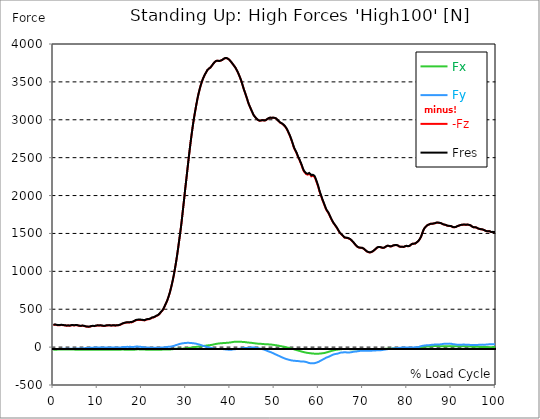
| Category |  Fx |  Fy |  -Fz |  Fres |
|---|---|---|---|---|
| 0.0 | -33.415 | -25.432 | 290.895 | 294.033 |
| 0.167348456675344 | -33.656 | -25.358 | 293.309 | 296.428 |
| 0.334696913350688 | -33.86 | -25.006 | 295.648 | 298.729 |
| 0.5020453700260321 | -33.768 | -24.244 | 294.497 | 297.523 |
| 0.669393826701376 | -33.656 | -23.873 | 292.882 | 295.871 |
| 0.83674228337672 | -33.378 | -23.39 | 291.564 | 294.497 |
| 1.0040907400520642 | -32.988 | -23.632 | 288.259 | 291.192 |
| 1.1621420602454444 | -32.988 | -24.486 | 287.127 | 290.153 |
| 1.3294905169207885 | -33.044 | -24.838 | 287.851 | 290.914 |
| 1.4968389735961325 | -33.081 | -24.95 | 288.909 | 291.972 |
| 1.6641874302714765 | -33.155 | -24.653 | 290.654 | 293.68 |
| 1.8315358869468206 | -33.044 | -23.817 | 291.471 | 294.404 |
| 1.9988843436221646 | -32.728 | -23.056 | 290.691 | 293.532 |
| 2.1662328002975086 | -32.431 | -22.834 | 289.689 | 292.492 |
| 2.333581256972853 | -32.264 | -22.963 | 287.628 | 290.45 |
| 2.5009297136481967 | -32.208 | -23.056 | 287.48 | 290.301 |
| 2.6682781703235405 | -31.911 | -22.017 | 286.032 | 288.742 |
| 2.8356266269988843 | -31.67 | -21.627 | 282.913 | 285.605 |
| 3.002975083674229 | -31.707 | -22.221 | 282.152 | 284.899 |
| 3.1703235403495724 | -32.023 | -22.425 | 283.711 | 286.496 |
| 3.337671997024917 | -32.227 | -21.775 | 284.732 | 287.461 |
| 3.4957233172182973 | -32.134 | -21.07 | 283.34 | 286.032 |
| 3.663071773893641 | -31.967 | -21.256 | 281.428 | 284.138 |
| 3.8304202305689854 | -32.431 | -22.091 | 283.359 | 286.162 |
| 3.997768687244329 | -32.858 | -22.611 | 286.644 | 289.485 |
| 4.165117143919673 | -33.081 | -21.942 | 289.095 | 291.898 |
| 4.332465600595017 | -33.081 | -20.996 | 289.745 | 292.473 |
| 4.499814057270361 | -33.007 | -20.81 | 287.925 | 290.636 |
| 4.667162513945706 | -33.044 | -21.07 | 285.679 | 288.464 |
| 4.834510970621049 | -33.359 | -21.218 | 286.83 | 289.67 |
| 5.001859427296393 | -33.545 | -21.163 | 288.705 | 291.545 |
| 5.169207883971737 | -33.638 | -20.272 | 290.171 | 292.956 |
| 5.336556340647081 | -33.266 | -18.638 | 288.594 | 291.248 |
| 5.503904797322425 | -33.081 | -18.527 | 285.66 | 288.315 |
| 5.671253253997769 | -33.229 | -17.784 | 283.396 | 286.05 |
| 5.82930457419115 | -33.229 | -17.84 | 279.739 | 282.43 |
| 5.996653030866494 | -33.229 | -17.97 | 279.33 | 282.041 |
| 6.164001487541838 | -33.359 | -17.766 | 279.627 | 282.375 |
| 6.331349944217181 | -33.638 | -17.469 | 280.388 | 283.154 |
| 6.498698400892526 | -33.972 | -16.782 | 281.112 | 283.897 |
| 6.66604685756787 | -34.547 | -16.132 | 281.168 | 283.99 |
| 6.833395314243213 | -35.03 | -15.13 | 280.203 | 283.043 |
| 7.000743770918558 | -35.067 | -13.979 | 277.604 | 280.407 |
| 7.168092227593902 | -35.049 | -13.088 | 275.116 | 277.901 |
| 7.335440684269246 | -34.807 | -12.865 | 271.868 | 274.634 |
| 7.50278914094459 | -34.584 | -12.401 | 269.64 | 272.387 |
| 7.6701375976199335 | -34.362 | -11.714 | 268.396 | 271.106 |
| 7.837486054295278 | -34.139 | -10.99 | 267.245 | 269.937 |
| 7.995537374488658 | -33.712 | -9.932 | 267.319 | 269.974 |
| 8.162885831164003 | -33.731 | -9.096 | 268.378 | 271.014 |
| 8.330234287839346 | -33.99 | -9.245 | 270.754 | 273.427 |
| 8.49758274451469 | -34.213 | -9.208 | 274.207 | 276.88 |
| 8.664931201190035 | -34.176 | -8.447 | 277.362 | 279.961 |
| 8.832279657865378 | -34.102 | -7.5 | 278.476 | 281.02 |
| 8.999628114540721 | -34.102 | -6.924 | 278.105 | 280.63 |
| 9.166976571216066 | -34.083 | -6.72 | 277.455 | 279.961 |
| 9.334325027891412 | -34.046 | -6.609 | 276.713 | 279.237 |
| 9.501673484566755 | -34.325 | -6.72 | 279.442 | 281.985 |
| 9.669021941242098 | -34.714 | -6.776 | 282.467 | 285.066 |
| 9.836370397917442 | -34.51 | -5.365 | 284.584 | 287.09 |
| 10.003718854592787 | -34.584 | -4.752 | 285.048 | 287.535 |
| 10.17106731126813 | -34.677 | -4.233 | 285.289 | 287.777 |
| 10.329118631461512 | -34.603 | -4.492 | 283.767 | 286.255 |
| 10.496467088136853 | -34.454 | -4.492 | 284.732 | 287.201 |
| 10.663815544812199 | -34.287 | -4.344 | 285.456 | 287.888 |
| 10.831164001487544 | -34.12 | -3.806 | 285.178 | 287.591 |
| 10.998512458162887 | -33.99 | -3.509 | 282.802 | 285.215 |
| 11.16586091483823 | -33.842 | -3.509 | 280.184 | 282.579 |
| 11.333209371513574 | -33.879 | -3.713 | 278.718 | 281.131 |
| 11.50055782818892 | -34.028 | -4.251 | 278.105 | 280.537 |
| 11.667906284864264 | -34.12 | -4.604 | 279.219 | 281.632 |
| 11.835254741539607 | -34.028 | -4.641 | 282.189 | 284.547 |
| 12.00260319821495 | -33.879 | -4.511 | 284.862 | 287.183 |
| 12.169951654890292 | -33.656 | -3.806 | 285.883 | 288.148 |
| 12.337300111565641 | -33.805 | -4.511 | 286.459 | 288.742 |
| 12.504648568240984 | -33.842 | -4.938 | 287.405 | 289.689 |
| 12.662699888434362 | -33.656 | -4.622 | 287.944 | 290.19 |
| 12.830048345109708 | -33.433 | -4.047 | 285.66 | 287.87 |
| 12.997396801785053 | -33.396 | -4.381 | 283.563 | 285.79 |
| 13.164745258460396 | -33.656 | -5.346 | 282.95 | 285.215 |
| 13.33209371513574 | -33.842 | -5.328 | 284.825 | 287.108 |
| 13.499442171811083 | -34.176 | -5.124 | 287.517 | 289.819 |
| 13.666790628486426 | -34.343 | -4.715 | 287.517 | 289.837 |
| 13.834139085161771 | -34.176 | -3.843 | 285.252 | 287.554 |
| 14.001487541837117 | -34.38 | -4.084 | 283.229 | 285.568 |
| 14.16883599851246 | -34.399 | -4.641 | 284.732 | 287.071 |
| 14.336184455187803 | -34.269 | -4.808 | 287.758 | 290.079 |
| 14.503532911863147 | -33.99 | -4.474 | 288.519 | 290.803 |
| 14.670881368538492 | -33.842 | -4.511 | 287.665 | 289.967 |
| 14.828932688731873 | -33.86 | -4.882 | 288.686 | 291.025 |
| 14.996281145407215 | -33.86 | -5.161 | 292.158 | 294.534 |
| 15.163629602082558 | -33.582 | -4.363 | 296.557 | 298.952 |
| 15.330978058757903 | -33.266 | -3.23 | 301.068 | 303.519 |
| 15.498326515433247 | -33.136 | -2.042 | 306.489 | 309.032 |
| 15.665674972108594 | -32.951 | -0.297 | 311 | 313.729 |
| 15.833023428783937 | -32.988 | 0.668 | 313.692 | 316.532 |
| 16.00037188545928 | -33.304 | 0.705 | 316.755 | 319.688 |
| 16.167720342134626 | -33.489 | 1.355 | 319.911 | 322.881 |
| 16.335068798809967 | -33.582 | 2.023 | 322.194 | 325.201 |
| 16.502417255485312 | -33.582 | 2.673 | 323.661 | 326.724 |
| 16.669765712160658 | -33.582 | 3.397 | 324.515 | 327.633 |
| 16.837114168836 | -33.693 | 3.267 | 323.735 | 326.891 |
| 17.004462625511344 | -33.879 | 2.692 | 324.069 | 327.262 |
| 17.16251394570472 | -33.638 | 2.989 | 326.872 | 330.102 |
| 17.32986240238007 | -33.489 | 3.713 | 326.501 | 329.787 |
| 17.497210859055414 | -33.693 | 3.174 | 325.313 | 328.673 |
| 17.664559315730756 | -34.157 | 2.283 | 326.334 | 329.768 |
| 17.8319077724061 | -34.454 | 1.838 | 329.824 | 333.37 |
| 17.999256229081443 | -34.64 | 1.819 | 334.539 | 338.14 |
| 18.166604685756788 | -34.77 | 1.931 | 338.902 | 342.651 |
| 18.333953142432133 | -34.38 | 3.267 | 343.561 | 347.589 |
| 18.501301599107478 | -33.433 | 5.068 | 348.759 | 353.01 |
| 18.668650055782823 | -32.115 | 6.423 | 354.013 | 358.375 |
| 18.835998512458165 | -30.983 | 6.869 | 356.129 | 360.491 |
| 19.00334696913351 | -29.758 | 7.054 | 358.264 | 362.608 |
| 19.170695425808855 | -29.312 | 6.887 | 359.693 | 363.926 |
| 19.338043882484197 | -29.832 | 5.662 | 358.913 | 363.035 |
| 19.496095202677576 | -30.129 | 5.086 | 359.953 | 364.037 |
| 19.66344365935292 | -30.408 | 4.307 | 359.396 | 363.387 |
| 19.830792116028263 | -30.927 | 2.246 | 357.057 | 360.788 |
| 19.998140572703612 | -31.447 | 1.299 | 357.744 | 361.457 |
| 20.165489029378953 | -32.004 | 0.204 | 356.426 | 360.046 |
| 20.3328374860543 | -32.561 | -1.708 | 354.031 | 357.447 |
| 20.500185942729644 | -32.802 | -3.341 | 351.618 | 354.904 |
| 20.667534399404985 | -32.914 | -4.66 | 352.583 | 355.85 |
| 20.83488285608033 | -33.471 | -5.922 | 356.834 | 360.213 |
| 21.002231312755672 | -33.768 | -5.903 | 362.106 | 365.485 |
| 21.16957976943102 | -33.823 | -5.532 | 365.374 | 368.697 |
| 21.336928226106362 | -34.028 | -5.866 | 367.453 | 370.813 |
| 21.504276682781704 | -34.065 | -6.256 | 368.622 | 372.001 |
| 21.67162513945705 | -33.916 | -6.72 | 368.827 | 372.242 |
| 21.82967645965043 | -34.139 | -8.001 | 371.537 | 375.027 |
| 21.997024916325774 | -34.454 | -8.836 | 376.865 | 380.392 |
| 22.16437337300112 | -34.566 | -8.799 | 383.678 | 387.149 |
| 22.33172182967646 | -34.584 | -8.279 | 388.207 | 391.623 |
| 22.499070286351806 | -34.38 | -8.224 | 389.135 | 392.533 |
| 22.666418743027148 | -34.343 | -8.874 | 391.289 | 394.705 |
| 22.833767199702496 | -34.659 | -9.115 | 395.744 | 399.141 |
| 23.00111565637784 | -34.956 | -9.598 | 400.589 | 404.005 |
| 23.168464113053183 | -35.141 | -9.746 | 407.179 | 410.595 |
| 23.335812569728528 | -35.29 | -9.152 | 412.86 | 416.22 |
| 23.50316102640387 | -35.216 | -8.725 | 416.703 | 420.007 |
| 23.670509483079215 | -35.03 | -8.335 | 420.267 | 423.516 |
| 23.83785793975456 | -35.178 | -8.576 | 426.653 | 429.902 |
| 23.995909259947936 | -35.104 | -8.428 | 438.125 | 441.281 |
| 24.163257716623285 | -34.881 | -7.426 | 450.637 | 453.663 |
| 24.330606173298627 | -34.213 | -5.848 | 462.778 | 465.637 |
| 24.49795462997397 | -33.638 | -5.031 | 473.638 | 476.348 |
| 24.665303086649313 | -33.099 | -4.307 | 484.368 | 486.93 |
| 24.83265154332466 | -32.914 | -3.954 | 499.405 | 501.892 |
| 25.0 | -32.505 | -3.787 | 517.727 | 520.122 |
| 25.167348456675345 | -32.06 | -2.896 | 539.001 | 541.285 |
| 25.334696913350694 | -31.429 | -1.875 | 560.74 | 562.819 |
| 25.502045370026035 | -30.593 | -0.13 | 581.661 | 583.555 |
| 25.669393826701377 | -29.962 | 1.578 | 602.527 | 604.272 |
| 25.836742283376722 | -30.111 | 2.673 | 628.739 | 630.391 |
| 26.004090740052067 | -30.333 | 3.843 | 657.42 | 658.998 |
| 26.17143919672741 | -30.705 | 4.363 | 687.92 | 689.424 |
| 26.329490516920792 | -30.909 | 4.455 | 719.943 | 721.354 |
| 26.49683897359613 | -30.389 | 5.773 | 757.071 | 758.426 |
| 26.66418743027148 | -29.572 | 8.075 | 796.389 | 797.688 |
| 26.831535886946828 | -28.533 | 9.876 | 838.065 | 839.364 |
| 26.998884343622166 | -27.177 | 12.642 | 882.692 | 883.973 |
| 27.166232800297514 | -25.729 | 15.427 | 930.216 | 931.515 |
| 27.333581256972852 | -24.597 | 17.821 | 981.322 | 982.622 |
| 27.5009297136482 | -23.409 | 21.274 | 1037.162 | 1038.517 |
| 27.668278170323543 | -22.444 | 25.006 | 1094.562 | 1096.028 |
| 27.835626626998888 | -21.608 | 28.198 | 1154.337 | 1155.841 |
| 28.002975083674233 | -20.996 | 31.243 | 1218.958 | 1220.499 |
| 28.170323540349575 | -20.773 | 34.714 | 1286.753 | 1288.368 |
| 28.33767199702492 | -20.587 | 37.815 | 1358.187 | 1359.839 |
| 28.50502045370026 | -20.55 | 40.673 | 1429.936 | 1431.625 |
| 28.663071773893645 | -20.903 | 43.328 | 1500.59 | 1502.298 |
| 28.830420230568986 | -21.59 | 45.259 | 1575.18 | 1576.85 |
| 28.99776868724433 | -21.794 | 47.189 | 1655.153 | 1656.805 |
| 29.165117143919673 | -20.513 | 49.491 | 1742.124 | 1743.758 |
| 29.33246560059502 | -19.808 | 50.865 | 1830.507 | 1832.066 |
| 29.499814057270367 | -19.232 | 52.257 | 1917.256 | 1918.778 |
| 29.66716251394571 | -18.155 | 53.371 | 2006.399 | 2007.884 |
| 29.834510970621054 | -17.042 | 54.633 | 2098.606 | 2100.054 |
| 30.00185942729639 | -16.448 | 55.395 | 2182.719 | 2184.129 |
| 30.169207883971744 | -15 | 56.063 | 2268.502 | 2269.876 |
| 30.33655634064708 | -13.217 | 56.545 | 2355.474 | 2356.792 |
| 30.50390479732243 | -11.732 | 56.527 | 2442.185 | 2443.448 |
| 30.671253253997772 | -10.507 | 56.323 | 2527.115 | 2528.322 |
| 30.829304574191156 | -9.468 | 55.432 | 2608.592 | 2609.724 |
| 30.996653030866494 | -8.502 | 54.206 | 2688.917 | 2690.013 |
| 31.164001487541842 | -7.407 | 53.594 | 2764.769 | 2765.846 |
| 31.331349944217187 | -6.033 | 53.018 | 2836.964 | 2838.004 |
| 31.498698400892525 | -4.455 | 51.83 | 2907.061 | 2908.101 |
| 31.666046857567874 | -2.766 | 50.382 | 2973.464 | 2974.485 |
| 31.833395314243212 | -1.151 | 49.25 | 3034.595 | 3035.597 |
| 32.00074377091856 | 0.353 | 48.452 | 3091.939 | 3092.941 |
| 32.1680922275939 | 1.764 | 47.264 | 3146.813 | 3147.797 |
| 32.33544068426925 | 3.082 | 44.201 | 3201.317 | 3202.264 |
| 32.50278914094459 | 4.381 | 41.286 | 3253.166 | 3254.094 |
| 32.670137597619934 | 5.681 | 38.891 | 3301.153 | 3302.044 |
| 32.83748605429528 | 7.017 | 36.497 | 3345.242 | 3346.115 |
| 33.004834510970625 | 8.447 | 34.269 | 3385.08 | 3385.916 |
| 33.162885831164004 | 9.653 | 31.484 | 3421.911 | 3422.746 |
| 33.33023428783935 | 10.544 | 28.013 | 3456.236 | 3457.034 |
| 33.497582744514695 | 11.565 | 24.579 | 3488.054 | 3488.796 |
| 33.664931201190036 | 13.125 | 21.386 | 3516.531 | 3517.255 |
| 33.83227965786538 | 14.461 | 18.155 | 3542.242 | 3542.929 |
| 33.99962811454073 | 15.408 | 14.888 | 3565.02 | 3565.669 |
| 34.16697657121607 | 16.578 | 12.159 | 3585.273 | 3585.885 |
| 34.33432502789141 | 17.469 | 8.985 | 3604.746 | 3605.34 |
| 34.50167348456676 | 18.972 | 6.293 | 3621.899 | 3622.493 |
| 34.6690219412421 | 20.643 | 3.453 | 3639.182 | 3639.776 |
| 34.83637039791744 | 22.295 | 0.613 | 3656.465 | 3657.041 |
| 35.00371885459279 | 23.558 | -2.209 | 3668.495 | 3669.07 |
| 35.17106731126814 | 24.876 | -4.121 | 3675.512 | 3676.087 |
| 35.338415767943474 | 25.414 | -5.328 | 3678.556 | 3679.113 |
| 35.49646708813686 | 26.472 | -7.908 | 3688.562 | 3689.082 |
| 35.6638155448122 | 28.031 | -10.266 | 3700.239 | 3700.74 |
| 35.831164001487544 | 30.055 | -12.271 | 3713.289 | 3713.79 |
| 35.998512458162885 | 31.596 | -14.833 | 3726.729 | 3727.231 |
| 36.165860914838234 | 33.601 | -17.691 | 3740.597 | 3741.098 |
| 36.333209371513576 | 36.348 | -19.511 | 3752.756 | 3753.257 |
| 36.50055782818892 | 38.65 | -21.664 | 3763.059 | 3763.597 |
| 36.667906284864266 | 40.395 | -23.539 | 3770.67 | 3771.245 |
| 36.83525474153961 | 42.511 | -25.08 | 3776.703 | 3777.297 |
| 37.002603198214956 | 44.423 | -26.138 | 3779.655 | 3780.286 |
| 37.1699516548903 | 46.15 | -25.748 | 3778.819 | 3779.469 |
| 37.337300111565646 | 47.375 | -25.358 | 3776.425 | 3777.093 |
| 37.50464856824098 | 47.876 | -25.395 | 3774.791 | 3775.459 |
| 37.66269988843437 | 49.51 | -25.061 | 3777.761 | 3778.467 |
| 37.83004834510971 | 50.401 | -25.247 | 3781.121 | 3781.845 |
| 37.99739680178505 | 51.478 | -25.432 | 3784.426 | 3785.168 |
| 38.16474525846039 | 52.666 | -25.321 | 3788.733 | 3789.475 |
| 38.33209371513574 | 52.833 | -25.878 | 3795.824 | 3796.567 |
| 38.49944217181109 | 52.814 | -27.345 | 3803.342 | 3804.085 |
| 38.666790628486424 | 52.796 | -29.201 | 3810.081 | 3810.824 |
| 38.83413908516178 | 53.482 | -30.315 | 3813.033 | 3813.775 |
| 39.001487541837115 | 55.58 | -30.352 | 3814.054 | 3814.833 |
| 39.16883599851246 | 56.323 | -31.484 | 3813.571 | 3814.351 |
| 39.336184455187805 | 56.991 | -32.895 | 3810.304 | 3811.102 |
| 39.503532911863154 | 58.216 | -33.341 | 3804.53 | 3805.329 |
| 39.670881368538495 | 58.866 | -33.916 | 3797.049 | 3797.847 |
| 39.83822982521384 | 59.571 | -34.51 | 3788.343 | 3789.16 |
| 39.996281145407224 | 61.354 | -34.195 | 3776.815 | 3777.65 |
| 40.163629602082565 | 62.931 | -33.916 | 3765.175 | 3766.029 |
| 40.33097805875791 | 64.231 | -33.452 | 3753.127 | 3754 |
| 40.498326515433256 | 66.663 | -31.503 | 3740.058 | 3740.986 |
| 40.6656749721086 | 68.315 | -29.814 | 3727.156 | 3728.103 |
| 40.83302342878393 | 69.466 | -28.607 | 3714.421 | 3715.387 |
| 41.00037188545929 | 70.357 | -27.66 | 3701.78 | 3702.763 |
| 41.16772034213463 | 70.765 | -26.268 | 3686.928 | 3687.949 |
| 41.33506879880997 | 70.97 | -26.082 | 3669.293 | 3670.332 |
| 41.50241725548531 | 70.673 | -26.324 | 3650.71 | 3651.75 |
| 41.66976571216066 | 70.858 | -24.597 | 3631.775 | 3632.833 |
| 41.837114168836 | 70.765 | -23.502 | 3610.315 | 3611.392 |
| 42.004462625511344 | 70.728 | -22.147 | 3586.647 | 3587.723 |
| 42.17181108218669 | 70.171 | -21.738 | 3562.996 | 3564.11 |
| 42.32986240238007 | 69.614 | -20.921 | 3537.879 | 3539.012 |
| 42.497210859055414 | 69.243 | -19.548 | 3510.275 | 3511.426 |
| 42.66455931573076 | 69.002 | -17.134 | 3479.979 | 3481.13 |
| 42.831907772406105 | 68.649 | -14.517 | 3446.675 | 3447.826 |
| 42.999256229081446 | 68.166 | -12.493 | 3413.891 | 3415.042 |
| 43.16660468575679 | 67.238 | -12.271 | 3385.433 | 3386.64 |
| 43.33395314243214 | 65.92 | -12.865 | 3357.439 | 3358.664 |
| 43.50130159910748 | 64.361 | -13.96 | 3328.386 | 3329.649 |
| 43.66865005578282 | 63.136 | -13.292 | 3299.315 | 3300.596 |
| 43.83599851245817 | 61.725 | -12.586 | 3270.133 | 3271.395 |
| 44.00334696913351 | 60.871 | -11.565 | 3237.201 | 3238.444 |
| 44.17069542580886 | 59.943 | -10.154 | 3209.262 | 3210.524 |
| 44.3380438824842 | 59.033 | -8.521 | 3185.445 | 3186.688 |
| 44.49609520267758 | 58.142 | -7.778 | 3163.15 | 3164.43 |
| 44.66344365935292 | 57.307 | -6.534 | 3140.65 | 3141.912 |
| 44.83079211602827 | 56.23 | -4.919 | 3118.633 | 3119.914 |
| 44.99814057270361 | 54.782 | -4.177 | 3096.895 | 3098.139 |
| 45.16548902937895 | 53.111 | -4.233 | 3074.099 | 3075.324 |
| 45.332837486054295 | 51.775 | -5.495 | 3056.63 | 3057.874 |
| 45.500185942729644 | 50.735 | -6.386 | 3045.139 | 3046.364 |
| 45.66753439940499 | 49.454 | -8.131 | 3032.349 | 3033.555 |
| 45.83488285608033 | 48.173 | -9.913 | 3019.911 | 3021.099 |
| 46.00223131275568 | 46.967 | -12.048 | 3010.499 | 3011.687 |
| 46.16957976943102 | 45.667 | -14.016 | 3000.066 | 3001.254 |
| 46.336928226106366 | 44.925 | -15.742 | 2994.738 | 2995.945 |
| 46.50427668278171 | 44.256 | -17.153 | 2990.487 | 2991.694 |
| 46.671625139457056 | 43.569 | -18.749 | 2987.201 | 2988.408 |
| 46.829676459650436 | 43.328 | -20.457 | 2988.464 | 2989.67 |
| 46.99702491632577 | 42.994 | -22.462 | 2990.951 | 2992.139 |
| 47.16437337300112 | 42.493 | -24.894 | 2994.089 | 2995.277 |
| 47.33172182967646 | 41.639 | -27.623 | 2994.683 | 2995.852 |
| 47.49907028635181 | 40.748 | -30.389 | 2993.736 | 2994.924 |
| 47.66641874302716 | 39.43 | -33.304 | 2990.264 | 2991.471 |
| 47.83376719970249 | 38 | -36.534 | 2987.981 | 2989.188 |
| 48.001115656377834 | 37.369 | -40.432 | 2993.105 | 2994.33 |
| 48.16846411305319 | 37.221 | -44.609 | 3000.66 | 3001.922 |
| 48.33581256972853 | 36.979 | -48.767 | 3007.844 | 3009.125 |
| 48.50316102640387 | 36.608 | -52.926 | 3014.379 | 3015.715 |
| 48.67050948307921 | 36.107 | -56.713 | 3019.688 | 3021.062 |
| 48.837857939754564 | 35.476 | -60.128 | 3023.772 | 3025.164 |
| 49.005206396429905 | 34.881 | -63.637 | 3027.522 | 3028.914 |
| 49.163257716623285 | 34.269 | -67.48 | 3027.893 | 3029.341 |
| 49.33060617329863 | 33.044 | -71.118 | 3024.106 | 3025.591 |
| 49.49795462997397 | 31.874 | -75.332 | 3025.35 | 3026.891 |
| 49.66530308664932 | 30.575 | -79.528 | 3027.002 | 3028.58 |
| 49.832651543324666 | 28.978 | -84.466 | 3025.777 | 3027.411 |
| 50.0 | 27.345 | -89.552 | 3024.069 | 3025.796 |
| 50.16734845667534 | 26.027 | -94.249 | 3021.619 | 3023.438 |
| 50.33469691335069 | 24.987 | -98.537 | 3016.885 | 3018.816 |
| 50.50204537002604 | 23.595 | -102.175 | 3006.749 | 3008.791 |
| 50.66939382670139 | 21.961 | -106.501 | 2997.337 | 2999.491 |
| 50.836742283376715 | 20.16 | -110.993 | 2987.74 | 2990.023 |
| 51.00409074005207 | 17.951 | -115.968 | 2977.66 | 2980.11 |
| 51.17143919672741 | 15.631 | -120.646 | 2968.248 | 2970.865 |
| 51.32949051692079 | 13.292 | -125.102 | 2959.745 | 2962.53 |
| 51.496838973596134 | 11.324 | -129.613 | 2956.348 | 2959.318 |
| 51.66418743027148 | 9.653 | -133.827 | 2949.869 | 2953.044 |
| 51.831535886946824 | 7.76 | -137.911 | 2942.295 | 2945.693 |
| 51.99888434362217 | 6.312 | -142.181 | 2934.888 | 2938.471 |
| 52.16623280029752 | 4.641 | -146.32 | 2925.551 | 2929.356 |
| 52.33358125697285 | 2.543 | -150.33 | 2915.081 | 2919.109 |
| 52.5009297136482 | 0.149 | -153.801 | 2901.752 | 2906.003 |
| 52.668278170323546 | -2.228 | -156.92 | 2887.179 | 2891.635 |
| 52.835626626998895 | -4.455 | -159.649 | 2870.528 | 2875.15 |
| 53.00297508367424 | -6.887 | -162.489 | 2849.977 | 2854.804 |
| 53.17032354034958 | -9.208 | -165.292 | 2828.518 | 2833.567 |
| 53.33767199702492 | -11.398 | -168.133 | 2807.058 | 2812.33 |
| 53.50502045370027 | -13.7 | -170.843 | 2784.094 | 2789.571 |
| 53.663071773893655 | -16.132 | -173.294 | 2758.718 | 2764.38 |
| 53.83042023056899 | -18.879 | -175.54 | 2731.206 | 2737.091 |
| 53.99776868724433 | -21.813 | -177.322 | 2702.618 | 2708.725 |
| 54.16511714391967 | -24.838 | -178.51 | 2672.656 | 2678.93 |
| 54.33246560059503 | -28.087 | -179.085 | 2642.099 | 2648.504 |
| 54.49981405727037 | -31.076 | -180.069 | 2617.261 | 2623.814 |
| 54.667162513945705 | -34.028 | -181.499 | 2597.361 | 2604.099 |
| 54.834510970621054 | -36.664 | -181.87 | 2578.258 | 2585.09 |
| 55.0018594272964 | -39.597 | -182.093 | 2557.987 | 2564.967 |
| 55.169207883971744 | -42.4 | -182.891 | 2532.369 | 2539.534 |
| 55.336556340647086 | -45.036 | -184.042 | 2506.936 | 2514.306 |
| 55.50390479732243 | -47.765 | -185.973 | 2487.221 | 2494.814 |
| 55.671253253997776 | -50.494 | -187.532 | 2466.393 | 2474.189 |
| 55.83860171067312 | -53.278 | -187.569 | 2441.146 | 2449.073 |
| 55.9966530308665 | -56.026 | -188.943 | 2419.296 | 2427.464 |
| 56.16400148754184 | -59.033 | -190.335 | 2393.251 | 2401.661 |
| 56.33134994421718 | -61.688 | -190.614 | 2365.034 | 2373.629 |
| 56.498698400892536 | -63.878 | -190.651 | 2338.803 | 2347.528 |
| 56.66604685756788 | -66.124 | -190.799 | 2319.126 | 2327.999 |
| 56.83339531424321 | -68.519 | -191.802 | 2305.091 | 2314.188 |
| 57.00074377091856 | -71.137 | -194.363 | 2294.12 | 2303.569 |
| 57.16809222759391 | -73.476 | -196.814 | 2283.854 | 2293.675 |
| 57.33544068426925 | -75.128 | -199.413 | 2276.54 | 2286.75 |
| 57.5027891409446 | -76.483 | -202.996 | 2276.299 | 2286.973 |
| 57.670137597619934 | -77.69 | -207.043 | 2281.794 | 2292.951 |
| 57.83748605429528 | -78.952 | -210.607 | 2286.49 | 2298.074 |
| 58.004834510970625 | -80.456 | -211.591 | 2277.041 | 2288.867 |
| 58.16288583116401 | -81.718 | -212.983 | 2269.634 | 2281.757 |
| 58.330234287839346 | -82.609 | -211.813 | 2254.245 | 2266.423 |
| 58.497582744514695 | -83.871 | -212.89 | 2263.211 | 2275.519 |
| 58.66493120119004 | -85.412 | -213.837 | 2262.023 | 2274.461 |
| 58.832279657865385 | -86.396 | -214.264 | 2260.761 | 2273.292 |
| 58.999628114540734 | -86.173 | -212.76 | 2249.715 | 2262.153 |
| 59.16697657121607 | -85.858 | -210.477 | 2233.194 | 2245.483 |
| 59.33432502789142 | -86.192 | -207.692 | 2208.299 | 2220.422 |
| 59.50167348456676 | -86.396 | -204.611 | 2181.233 | 2193.207 |
| 59.66902194124211 | -86.842 | -201.195 | 2153.221 | 2165.027 |
| 59.83637039791745 | -87.566 | -198.262 | 2124.614 | 2136.29 |
| 60.00371885459278 | -86.805 | -193.305 | 2091.867 | 2103.172 |
| 60.17106731126813 | -85.022 | -186.864 | 2055.723 | 2066.435 |
| 60.33841576794349 | -84.595 | -181.684 | 2025.835 | 2036.138 |
| 60.49646708813685 | -83.909 | -176.876 | 1999.679 | 2009.629 |
| 60.6638155448122 | -82.665 | -171.66 | 1970.831 | 1980.373 |
| 60.831164001487544 | -81.124 | -166.369 | 1942.354 | 1951.487 |
| 60.99851245816289 | -80.159 | -161.654 | 1917.07 | 1925.869 |
| 61.16586091483824 | -78.933 | -156.697 | 1892.696 | 1901.105 |
| 61.333209371513576 | -76.78 | -150.998 | 1867.263 | 1875.208 |
| 61.50055782818892 | -74.33 | -145.206 | 1842.035 | 1849.516 |
| 61.667906284864266 | -71.842 | -139.712 | 1817.642 | 1824.696 |
| 61.835254741539615 | -69.095 | -135.59 | 1799.264 | 1805.965 |
| 62.002603198214956 | -66.18 | -132.546 | 1785.601 | 1792.024 |
| 62.16995165489029 | -63.247 | -129.334 | 1771.139 | 1777.284 |
| 62.33730011156564 | -60.24 | -125.213 | 1752.074 | 1757.885 |
| 62.504648568240995 | -57.344 | -121.24 | 1731.617 | 1737.131 |
| 62.67199702491633 | -54.466 | -115.931 | 1710.064 | 1715.207 |
| 62.83004834510971 | -51.663 | -110.696 | 1690.331 | 1695.083 |
| 62.99739680178505 | -48.582 | -105.74 | 1671.6 | 1676.018 |
| 63.1647452584604 | -45.741 | -100.69 | 1653.055 | 1657.12 |
| 63.33209371513575 | -43.254 | -97.182 | 1637.238 | 1641.081 |
| 63.4994421718111 | -41.137 | -94.713 | 1623.835 | 1627.53 |
| 63.666790628486424 | -39.058 | -92.281 | 1610.395 | 1613.941 |
| 63.83413908516177 | -37.313 | -90.629 | 1596.379 | 1599.832 |
| 64.00148754183712 | -35.568 | -88.977 | 1582.364 | 1585.742 |
| 64.16883599851248 | -34.065 | -87.714 | 1567.958 | 1571.281 |
| 64.3361844551878 | -32.58 | -85.301 | 1550.768 | 1553.942 |
| 64.50353291186315 | -31.447 | -81.699 | 1533.467 | 1536.474 |
| 64.6708813685385 | -30.463 | -78.247 | 1517.594 | 1520.472 |
| 64.83822982521384 | -29.108 | -74.46 | 1504.247 | 1506.939 |
| 65.00557828188919 | -28.031 | -72.046 | 1493.35 | 1495.912 |
| 65.16362960208257 | -26.472 | -72.548 | 1487.02 | 1489.619 |
| 65.3309780587579 | -26.064 | -71.898 | 1477.385 | 1479.984 |
| 65.49832651543326 | -26.453 | -71.007 | 1465.876 | 1468.512 |
| 65.6656749721086 | -26.212 | -68.705 | 1454.589 | 1457.188 |
| 65.83302342878395 | -26.082 | -66.459 | 1445.233 | 1447.72 |
| 66.00037188545929 | -24.801 | -66.254 | 1441.483 | 1443.989 |
| 66.16772034213463 | -24.579 | -68.928 | 1442.299 | 1444.991 |
| 66.33506879880998 | -25.34 | -70.914 | 1441.724 | 1444.601 |
| 66.50241725548531 | -26.212 | -71.879 | 1438.698 | 1441.743 |
| 66.66976571216065 | -25.822 | -70.524 | 1432.813 | 1435.821 |
| 66.83711416883601 | -26.361 | -71.007 | 1431.829 | 1434.911 |
| 67.00446262551135 | -26.695 | -70.58 | 1428.005 | 1431.087 |
| 67.1718110821867 | -27.252 | -69.373 | 1421.359 | 1424.423 |
| 67.32986240238007 | -27.994 | -67.498 | 1412.56 | 1415.549 |
| 67.49721085905541 | -28.496 | -65.308 | 1403.371 | 1406.267 |
| 67.66455931573076 | -28.7 | -63.284 | 1393.625 | 1396.447 |
| 67.83190777240611 | -28.588 | -61.354 | 1382.338 | 1385.104 |
| 67.99925622908145 | -28.514 | -60.017 | 1370.068 | 1372.778 |
| 68.16660468575678 | -28.811 | -59.052 | 1358.15 | 1360.841 |
| 68.33395314243214 | -29.349 | -58.253 | 1346.491 | 1349.165 |
| 68.50130159910749 | -29.702 | -57.214 | 1336.114 | 1338.75 |
| 68.66865005578282 | -29.999 | -56.007 | 1326.925 | 1329.487 |
| 68.83599851245816 | -30.092 | -54.671 | 1319.592 | 1322.08 |
| 69.00334696913352 | -30.111 | -53.018 | 1314.599 | 1317.012 |
| 69.17069542580886 | -29.981 | -51.143 | 1312.074 | 1314.376 |
| 69.3380438824842 | -29.906 | -49.324 | 1310.608 | 1312.817 |
| 69.50539233915956 | -29.312 | -48.377 | 1310.069 | 1312.185 |
| 69.66344365935292 | -28.96 | -48.415 | 1309.438 | 1311.554 |
| 69.83079211602826 | -28.607 | -48.452 | 1308.825 | 1310.923 |
| 69.99814057270362 | -28.7 | -48.34 | 1304.407 | 1306.468 |
| 70.16548902937896 | -29.219 | -47.635 | 1298.244 | 1300.249 |
| 70.33283748605429 | -29.851 | -47.579 | 1289.983 | 1291.969 |
| 70.50018594272964 | -30.649 | -47.653 | 1281.444 | 1283.412 |
| 70.667534399405 | -31.596 | -47.394 | 1272.236 | 1274.222 |
| 70.83488285608033 | -32.617 | -47.895 | 1264.031 | 1266.036 |
| 71.00223131275568 | -33.266 | -47.542 | 1259.111 | 1261.098 |
| 71.16957976943102 | -33.879 | -47.876 | 1254.415 | 1256.42 |
| 71.33692822610637 | -34.343 | -48.377 | 1250.219 | 1252.261 |
| 71.50427668278171 | -34.436 | -48.08 | 1248.809 | 1250.869 |
| 71.67162513945706 | -34.584 | -48.043 | 1249.217 | 1251.278 |
| 71.8389735961324 | -34.603 | -47.561 | 1251.834 | 1253.876 |
| 71.99702491632577 | -34.733 | -46.67 | 1255.194 | 1257.181 |
| 72.16437337300113 | -34.454 | -45.89 | 1261.024 | 1262.973 |
| 72.33172182967647 | -34.028 | -45.37 | 1267.409 | 1269.322 |
| 72.49907028635181 | -33.619 | -44.795 | 1275.54 | 1277.378 |
| 72.66641874302715 | -33.118 | -44.498 | 1283.764 | 1285.583 |
| 72.8337671997025 | -32.134 | -44.015 | 1293.065 | 1294.791 |
| 73.00111565637783 | -30.853 | -43.161 | 1303.163 | 1304.816 |
| 73.16846411305319 | -29.721 | -42.4 | 1310.552 | 1312.111 |
| 73.33581256972853 | -28.737 | -42.196 | 1317.123 | 1318.627 |
| 73.50316102640387 | -28.236 | -43.012 | 1321.04 | 1322.526 |
| 73.67050948307921 | -27.939 | -42.753 | 1321.69 | 1323.157 |
| 73.83785793975457 | -27.864 | -42.53 | 1320.409 | 1321.839 |
| 74.00520639642991 | -27.827 | -41.843 | 1317.643 | 1319.073 |
| 74.16325771662328 | -27.772 | -40.191 | 1314.116 | 1315.508 |
| 74.33060617329863 | -27.623 | -38.371 | 1310.738 | 1312.093 |
| 74.49795462997398 | -26.992 | -36.329 | 1308.677 | 1309.976 |
| 74.66530308664932 | -26.268 | -34.807 | 1309.382 | 1310.608 |
| 74.83265154332466 | -24.69 | -33.433 | 1312.483 | 1313.689 |
| 75.00000000000001 | -23.131 | -32.19 | 1318.59 | 1319.76 |
| 75.16734845667534 | -21.664 | -31.057 | 1325.7 | 1326.851 |
| 75.3346969133507 | -20.81 | -29.127 | 1332.717 | 1333.85 |
| 75.50204537002605 | -20.606 | -27.177 | 1336.597 | 1337.748 |
| 75.66939382670138 | -20.736 | -26.064 | 1337.599 | 1338.732 |
| 75.83674228337672 | -20.624 | -25.971 | 1335.539 | 1336.653 |
| 76.00409074005208 | -21.237 | -25.024 | 1330.768 | 1331.845 |
| 76.17143919672742 | -21.738 | -24.244 | 1328.206 | 1329.264 |
| 76.33878765340276 | -21.441 | -22.444 | 1329.023 | 1330.1 |
| 76.49683897359614 | -20.792 | -20.624 | 1331.102 | 1332.142 |
| 76.66418743027148 | -19.659 | -19.102 | 1335.539 | 1336.56 |
| 76.83153588694682 | -18.527 | -17.599 | 1341.145 | 1342.203 |
| 76.99888434362218 | -17.45 | -16.151 | 1346.046 | 1347.123 |
| 77.16623280029752 | -17.487 | -15.557 | 1344.839 | 1345.916 |
| 77.33358125697285 | -17.561 | -15.092 | 1344.876 | 1345.953 |
| 77.5009297136482 | -16.93 | -14.276 | 1346.807 | 1347.884 |
| 77.66827817032356 | -16.392 | -13.403 | 1347.03 | 1348.107 |
| 77.83562662699889 | -16.707 | -12.512 | 1342.704 | 1343.8 |
| 78.00297508367423 | -17.209 | -11.343 | 1335.966 | 1337.061 |
| 78.17032354034959 | -17.487 | -10.34 | 1328.763 | 1329.858 |
| 78.33767199702493 | -17.617 | -9.263 | 1324.011 | 1325.106 |
| 78.50502045370027 | -17.431 | -7.908 | 1322.953 | 1324.048 |
| 78.67236891037561 | -16.392 | -6.924 | 1324.252 | 1325.347 |
| 78.83042023056899 | -15.928 | -6.534 | 1324.512 | 1325.589 |
| 78.99776868724433 | -16.522 | -6.052 | 1322.061 | 1323.157 |
| 79.16511714391969 | -16.689 | -5.384 | 1321.078 | 1322.154 |
| 79.33246560059503 | -16.095 | -4.567 | 1323.862 | 1324.902 |
| 79.49981405727036 | -15.222 | -3.973 | 1329.116 | 1330.118 |
| 79.66716251394571 | -14.368 | -3.787 | 1333.794 | 1334.796 |
| 79.83451097062107 | -14.294 | -4.585 | 1335.724 | 1336.727 |
| 80.00185942729641 | -14.758 | -4.901 | 1334.703 | 1335.706 |
| 80.16920788397174 | -15.241 | -4.901 | 1331.232 | 1332.216 |
| 80.33655634064709 | -15.464 | -4.641 | 1330.062 | 1331.009 |
| 80.50390479732243 | -15.037 | -4.14 | 1334.091 | 1335.019 |
| 80.67125325399778 | -13.997 | -4.214 | 1341.052 | 1341.999 |
| 80.83860171067312 | -12.549 | -4.065 | 1350.743 | 1351.708 |
| 80.99665303086651 | -11.38 | -4.01 | 1358.892 | 1359.876 |
| 81.16400148754184 | -11.045 | -4.251 | 1362.586 | 1363.552 |
| 81.3313499442172 | -10.897 | -3.787 | 1365.779 | 1366.726 |
| 81.49869840089255 | -11.398 | -3.601 | 1364.573 | 1365.501 |
| 81.66604685756786 | -11.899 | -3.397 | 1363.255 | 1364.201 |
| 81.83339531424322 | -11.38 | -2.673 | 1367.394 | 1368.323 |
| 82.00074377091858 | -10.34 | -1.968 | 1374.727 | 1375.655 |
| 82.16809222759392 | -9.486 | -1.689 | 1381.967 | 1382.895 |
| 82.33544068426926 | -8.799 | -1.689 | 1388.891 | 1389.801 |
| 82.50278914094459 | -8.15 | -0.278 | 1397.988 | 1398.842 |
| 82.67013759761994 | -7.463 | 2.525 | 1409.757 | 1410.537 |
| 82.83748605429528 | -6.405 | 5.681 | 1424.144 | 1424.868 |
| 83.00483451097062 | -4.715 | 9.709 | 1442.615 | 1443.283 |
| 83.17218296764597 | -2.896 | 12.568 | 1461.29 | 1461.94 |
| 83.33023428783935 | 0.074 | 15.037 | 1489.34 | 1490.009 |
| 83.4975827445147 | 2.896 | 17.264 | 1516.908 | 1517.613 |
| 83.66493120119004 | 5.068 | 18.861 | 1542.043 | 1542.767 |
| 83.83227965786537 | 6.2 | 19.789 | 1561.368 | 1562.092 |
| 83.99962811454073 | 7.593 | 21.627 | 1575.792 | 1576.535 |
| 84.16697657121607 | 8.465 | 22.815 | 1587.729 | 1588.471 |
| 84.33432502789142 | 8.112 | 23.428 | 1596.249 | 1596.992 |
| 84.50167348456677 | 7.945 | 23.687 | 1605.364 | 1606.125 |
| 84.6690219412421 | 8.187 | 23.91 | 1612.326 | 1613.087 |
| 84.83637039791745 | 8.298 | 24.226 | 1615.24 | 1616.02 |
| 85.0037188545928 | 9.003 | 25.785 | 1618.934 | 1619.77 |
| 85.17106731126813 | 10.062 | 27.957 | 1623.928 | 1624.838 |
| 85.33841576794349 | 10.748 | 29.071 | 1627.455 | 1628.421 |
| 85.50576422461883 | 11.51 | 29.554 | 1628.049 | 1629.07 |
| 85.66381554481221 | 12.141 | 30.63 | 1627.697 | 1628.755 |
| 85.83116400148755 | 13.013 | 31.28 | 1628.866 | 1629.98 |
| 85.99851245816289 | 14.22 | 32.45 | 1631.02 | 1632.226 |
| 86.16586091483823 | 14.647 | 33.415 | 1631.335 | 1632.597 |
| 86.33320937151358 | 14.907 | 33.86 | 1635.178 | 1636.459 |
| 86.50055782818893 | 15.315 | 34.306 | 1639.912 | 1641.23 |
| 86.66790628486427 | 15.501 | 34.529 | 1642.659 | 1643.996 |
| 86.83525474153961 | 15.167 | 34.547 | 1643.067 | 1644.404 |
| 87.00260319821496 | 14.406 | 34.473 | 1642.046 | 1643.383 |
| 87.16995165489031 | 13.496 | 35.049 | 1640.042 | 1641.397 |
| 87.33730011156564 | 12.883 | 35.531 | 1638.649 | 1640.004 |
| 87.504648568241 | 12.976 | 35.735 | 1638.631 | 1639.986 |
| 87.67199702491634 | 12.92 | 36.979 | 1634.602 | 1635.958 |
| 87.83004834510972 | 12.79 | 38.724 | 1628.718 | 1630.073 |
| 87.99739680178506 | 12.568 | 40.451 | 1623.334 | 1624.689 |
| 88.1647452584604 | 12.698 | 42.641 | 1619.027 | 1620.42 |
| 88.33209371513574 | 12.865 | 44.015 | 1616.484 | 1617.895 |
| 88.49944217181108 | 12.902 | 44.293 | 1615.24 | 1616.633 |
| 88.66679062848644 | 12.883 | 45.147 | 1612.456 | 1613.848 |
| 88.83413908516178 | 12.772 | 46.02 | 1608.743 | 1610.172 |
| 89.00148754183712 | 12.159 | 44.757 | 1603.601 | 1604.937 |
| 89.16883599851246 | 12.067 | 44.832 | 1600.928 | 1602.246 |
| 89.33618445518782 | 12.271 | 45.147 | 1599.034 | 1600.371 |
| 89.50353291186315 | 12.865 | 45.908 | 1599.22 | 1600.575 |
| 89.6708813685385 | 13.088 | 46.113 | 1598.291 | 1599.665 |
| 89.83822982521386 | 13.05 | 45.816 | 1597.233 | 1598.589 |
| 90.00557828188919 | 12.568 | 44.386 | 1594.727 | 1596.008 |
| 90.16362960208257 | 10.897 | 40.172 | 1586.336 | 1587.45 |
| 90.3309780587579 | 10.229 | 37.833 | 1582.791 | 1583.83 |
| 90.49832651543326 | 10.414 | 37.072 | 1583.199 | 1584.202 |
| 90.66567497210859 | 10.656 | 37.128 | 1582.104 | 1583.125 |
| 90.83302342878395 | 10.711 | 35.141 | 1582.364 | 1583.366 |
| 91.00037188545929 | 10.619 | 33.582 | 1584.554 | 1585.52 |
| 91.16772034213463 | 10.656 | 33.025 | 1589.251 | 1590.235 |
| 91.33506879880998 | 10.953 | 32.004 | 1595.785 | 1596.769 |
| 91.50241725548533 | 10.953 | 31.521 | 1599.034 | 1600.018 |
| 91.66976571216065 | 10.581 | 31.447 | 1602.134 | 1603.118 |
| 91.83711416883601 | 10.693 | 31.707 | 1605.531 | 1606.515 |
| 92.00446262551137 | 10.897 | 31.93 | 1609.207 | 1610.209 |
| 92.1718110821867 | 11.045 | 32.115 | 1613.031 | 1614.034 |
| 92.33915953886203 | 11.157 | 32.431 | 1614.368 | 1615.407 |
| 92.49721085905541 | 11.25 | 32.747 | 1615.37 | 1616.447 |
| 92.66455931573077 | 11.324 | 33.174 | 1615.5 | 1616.614 |
| 92.83190777240611 | 10.878 | 33.099 | 1615.649 | 1616.763 |
| 92.99925622908145 | 10.377 | 32.802 | 1615.593 | 1616.707 |
| 93.1666046857568 | 10.154 | 32.153 | 1614.795 | 1615.89 |
| 93.33395314243214 | 10.024 | 31.837 | 1614.906 | 1615.964 |
| 93.50130159910749 | 9.95 | 31.67 | 1615.537 | 1616.577 |
| 93.66865005578283 | 9.727 | 31.002 | 1616.15 | 1617.171 |
| 93.83599851245818 | 9.542 | 30.5 | 1615.166 | 1616.168 |
| 94.00334696913353 | 9.022 | 29.869 | 1612.196 | 1613.198 |
| 94.17069542580886 | 8.354 | 29.145 | 1609.244 | 1610.265 |
| 94.3380438824842 | 8.372 | 29.071 | 1606.497 | 1607.499 |
| 94.50539233915954 | 7.76 | 28.663 | 1599.739 | 1600.723 |
| 94.66344365935292 | 6.664 | 27.939 | 1590.643 | 1591.609 |
| 94.83079211602828 | 5.662 | 27.567 | 1583.719 | 1584.666 |
| 94.99814057270362 | 4.957 | 27.734 | 1581.139 | 1582.085 |
| 95.16548902937897 | 4.901 | 28.087 | 1581.621 | 1582.531 |
| 95.33283748605432 | 4.957 | 28.161 | 1580.971 | 1581.862 |
| 95.50018594272963 | 5.328 | 28.273 | 1579.95 | 1580.823 |
| 95.66753439940499 | 5.662 | 28.83 | 1577.723 | 1578.577 |
| 95.83488285608034 | 5.105 | 29.052 | 1571.819 | 1572.673 |
| 96.00223131275567 | 3.898 | 29.275 | 1565.675 | 1566.529 |
| 96.16957976943102 | 3.713 | 29.591 | 1562.872 | 1563.707 |
| 96.33692822610638 | 3.156 | 30.018 | 1559.66 | 1560.496 |
| 96.50427668278171 | 2.543 | 30.835 | 1555.947 | 1556.783 |
| 96.67162513945706 | 2.395 | 31.744 | 1555.019 | 1555.855 |
| 96.8389735961324 | 2.488 | 32.747 | 1554.537 | 1555.39 |
| 96.99702491632577 | 2.655 | 32.839 | 1553.014 | 1553.85 |
| 97.16437337300111 | 2.506 | 32.524 | 1549.858 | 1550.675 |
| 97.33172182967647 | 2.302 | 32.338 | 1545.812 | 1546.61 |
| 97.49907028635181 | 1.615 | 32.115 | 1540.651 | 1541.43 |
| 97.66641874302715 | 1.188 | 32.32 | 1536.177 | 1536.957 |
| 97.8337671997025 | 1.04 | 32.914 | 1532.278 | 1533.077 |
| 98.00111565637785 | 0.241 | 33.619 | 1528.974 | 1529.754 |
| 98.16846411305319 | -0.631 | 34.529 | 1526.709 | 1527.526 |
| 98.33581256972855 | -0.575 | 35.773 | 1527.619 | 1528.454 |
| 98.50316102640389 | -0.204 | 36.812 | 1529.271 | 1530.106 |
| 98.67050948307921 | -0.149 | 37.109 | 1527.842 | 1528.696 |
| 98.83785793975456 | -0.427 | 37.406 | 1523.238 | 1524.129 |
| 99.0052063964299 | -0.705 | 37.703 | 1518.634 | 1519.544 |
| 99.17255485310525 | -0.761 | 38.112 | 1517.91 | 1518.801 |
| 99.33060617329863 | -0.037 | 38.501 | 1519.859 | 1520.769 |
| 99.49795462997399 | 0.705 | 38.594 | 1520.695 | 1521.604 |
| 99.66530308664933 | 1.04 | 38.13 | 1519.562 | 1520.453 |
| 99.83265154332467 | 0.947 | 37.462 | 1516.796 | 1517.669 |
| 100.0 | 0.705 | 36.701 | 1513.009 | 1513.882 |